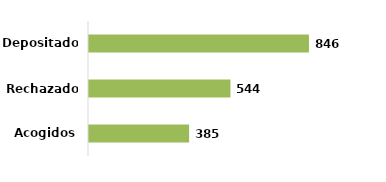
| Category | Series 0 |
|---|---|
| Acogidos | 385 |
| Rechazados | 544 |
| Depositados | 846 |